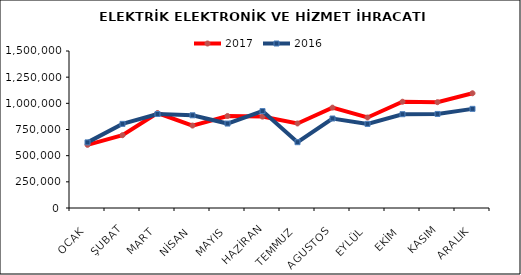
| Category | 2017 | 2016 |
|---|---|---|
| OCAK | 603352.432 | 626876.006 |
| ŞUBAT | 695489.652 | 803789.293 |
| MART | 907674.948 | 898068.699 |
| NİSAN | 787698.097 | 885562.187 |
| MAYIS | 879155.952 | 806840.714 |
| HAZİRAN | 873190.394 | 925883.764 |
| TEMMUZ | 807629.9 | 628736.268 |
| AGUSTOS | 958845.996 | 854979.49 |
| EYLÜL | 864789.204 | 803558.901 |
| EKİM | 1015305.538 | 896101.647 |
| KASIM | 1011102.98 | 898553.85 |
| ARALIK | 1096260.335 | 947213.502 |